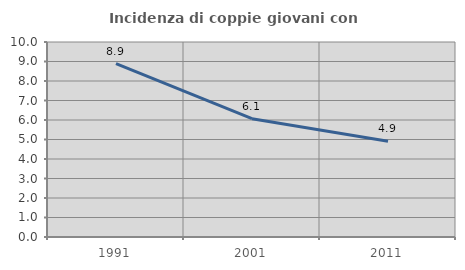
| Category | Incidenza di coppie giovani con figli |
|---|---|
| 1991.0 | 8.896 |
| 2001.0 | 6.066 |
| 2011.0 | 4.91 |